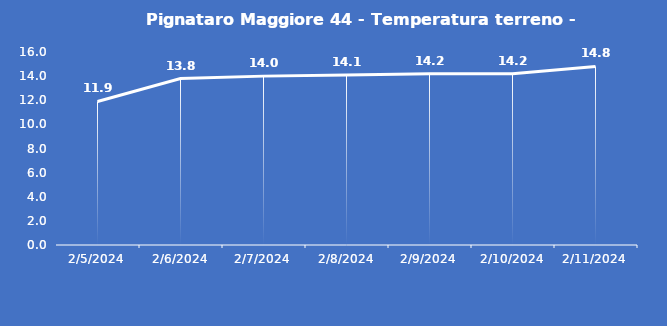
| Category | Pignataro Maggiore 44 - Temperatura terreno - Grezzo (°C) |
|---|---|
| 2/5/24 | 11.9 |
| 2/6/24 | 13.8 |
| 2/7/24 | 14 |
| 2/8/24 | 14.1 |
| 2/9/24 | 14.2 |
| 2/10/24 | 14.2 |
| 2/11/24 | 14.8 |